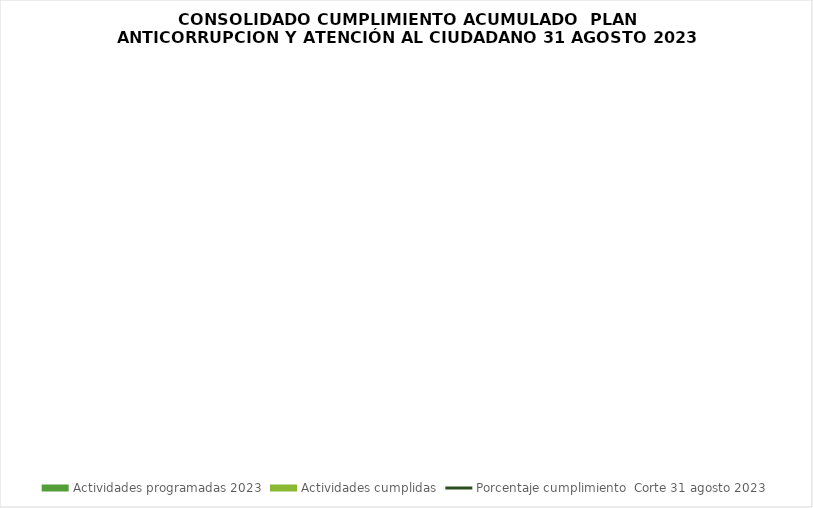
| Category | Actividades programadas 2023 | Actividades cumplidas |
|---|---|---|
| Componente 1: Gestión del Riesgo de Corrupción  -Mapa de Riesgos de Corrupción | 12 | 9 |
| Componente 2:  Racionalización de trámites | 22 | 8 |
| Componente 3: Atención al ciudadano | 41 | 21 |
| Componente 4: Rendición de cuentas | 21 | 12 |
| Componente 5:  Transparencia y Acceso a la Información | 17 | 9 |
|  Cumplimiento  | 113 | 59 |